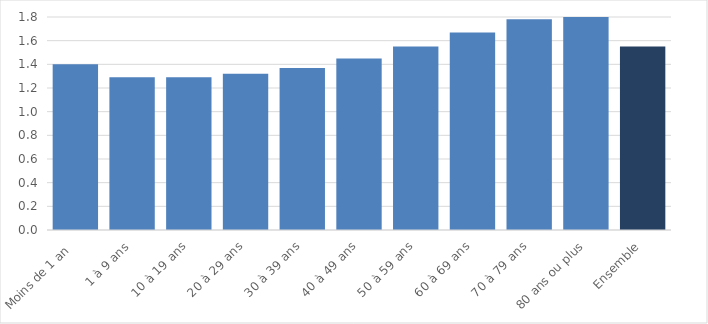
| Category | Nombre moyen d'hospitalisations |
|---|---|
| Moins de 1 an  | 1.4 |
| 1 à 9 ans | 1.29 |
| 10 à 19 ans | 1.29 |
| 20 à 29 ans | 1.32 |
| 30 à 39 ans | 1.37 |
| 40 à 49 ans | 1.45 |
| 50 à 59 ans | 1.55 |
| 60 à 69 ans | 1.67 |
| 70 à 79 ans | 1.78 |
| 80 ans ou plus | 1.8 |
| Ensemble | 1.55 |